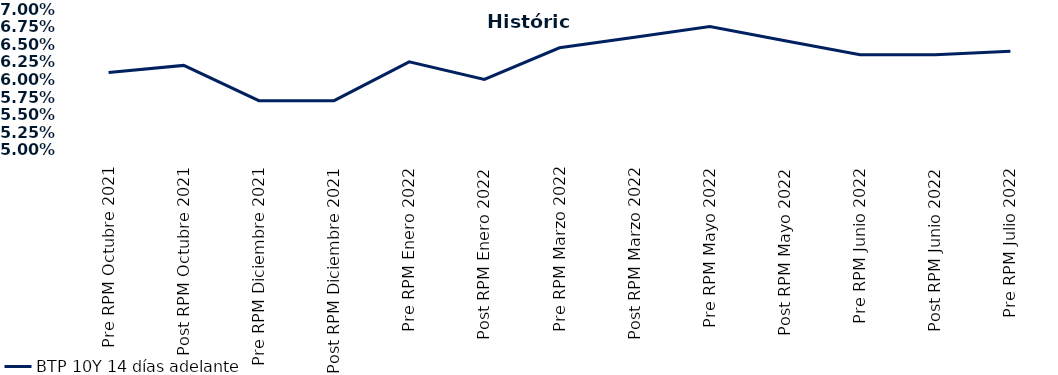
| Category | BTP 10Y 14 días adelante |
|---|---|
| Pre RPM Octubre 2021 | 0.061 |
| Post RPM Octubre 2021 | 0.062 |
| Pre RPM Diciembre 2021 | 0.057 |
| Post RPM Diciembre 2021 | 0.057 |
| Pre RPM Enero 2022 | 0.062 |
| Post RPM Enero 2022 | 0.06 |
| Pre RPM Marzo 2022 | 0.064 |
| Post RPM Marzo 2022 | 0.066 |
| Pre RPM Mayo 2022 | 0.068 |
| Post RPM Mayo 2022 | 0.066 |
| Pre RPM Junio 2022 | 0.064 |
| Post RPM Junio 2022 | 0.064 |
| Pre RPM Julio 2022 | 0.064 |